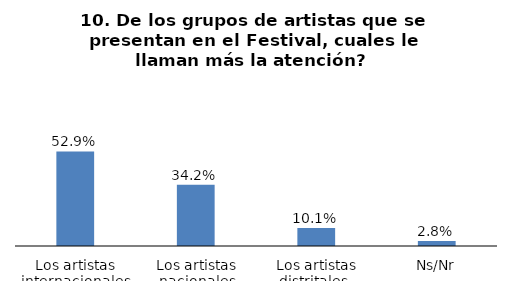
| Category | Series 0 |
|---|---|
| Los artistas internacionales | 0.529 |
| Los artistas nacionales | 0.342 |
| Los artistas distritales  | 0.101 |
| Ns/Nr | 0.028 |